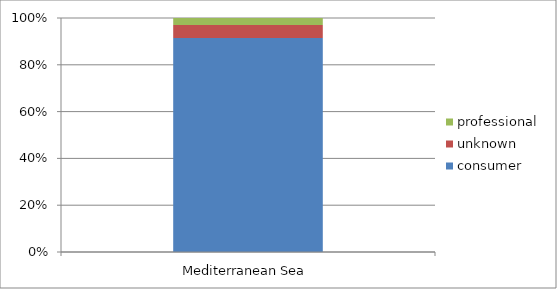
| Category | consumer | unknown | professional |
|---|---|---|---|
| Mediterranean Sea | 0.914 | 0.056 | 0.03 |